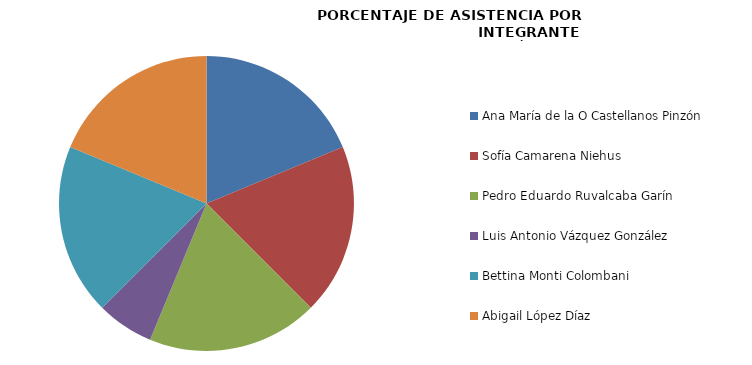
| Category | Series 0 |
|---|---|
| Ana María de la O Castellanos Pinzón | 100 |
| Sofía Camarena Niehus | 100 |
| Pedro Eduardo Ruvalcaba Garín | 100 |
| Luis Antonio Vázquez González | 33.333 |
| Bettina Monti Colombani | 100 |
| Abigail López Díaz | 100 |